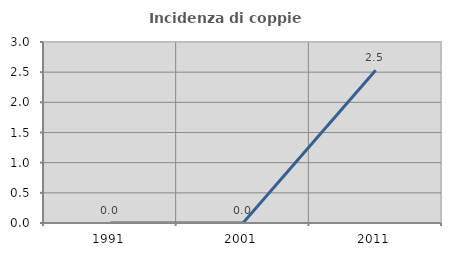
| Category | Incidenza di coppie miste |
|---|---|
| 1991.0 | 0 |
| 2001.0 | 0 |
| 2011.0 | 2.532 |